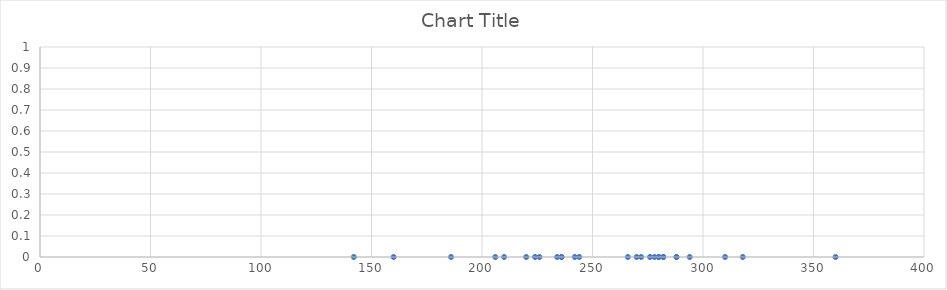
| Category | Series 0 |
|---|---|
| 270.0 | 0 |
| 236.0 | 0 |
| 210.0 | 0 |
| 142.0 | 0 |
| 280.0 | 0 |
| 272.0 | 0 |
| 160.0 | 0 |
| 220.0 | 0 |
| 226.0 | 0 |
| 242.0 | 0 |
| 186.0 | 0 |
| 266.0 | 0 |
| 206.0 | 0 |
| 318.0 | 0 |
| 294.0 | 0 |
| 282.0 | 0 |
| 234.0 | 0 |
| 224.0 | 0 |
| 276.0 | 0 |
| 282.0 | 0 |
| 360.0 | 0 |
| 310.0 | 0 |
| 280.0 | 0 |
| 278.0 | 0 |
| 288.0 | 0 |
| 288.0 | 0 |
| 244.0 | 0 |
| 236.0 | 0 |